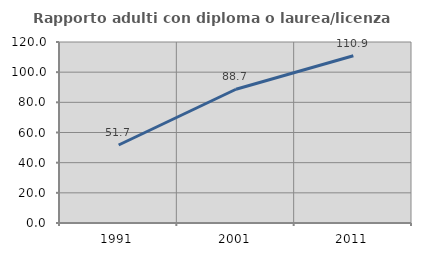
| Category | Rapporto adulti con diploma o laurea/licenza media  |
|---|---|
| 1991.0 | 51.724 |
| 2001.0 | 88.665 |
| 2011.0 | 110.859 |